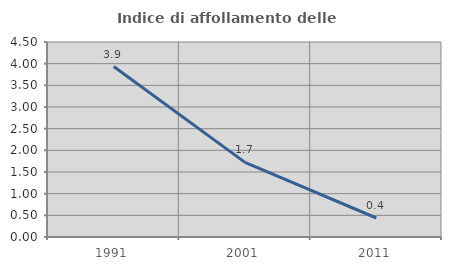
| Category | Indice di affollamento delle abitazioni  |
|---|---|
| 1991.0 | 3.934 |
| 2001.0 | 1.721 |
| 2011.0 | 0.439 |